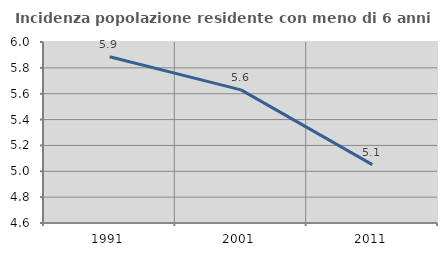
| Category | Incidenza popolazione residente con meno di 6 anni |
|---|---|
| 1991.0 | 5.886 |
| 2001.0 | 5.63 |
| 2011.0 | 5.051 |